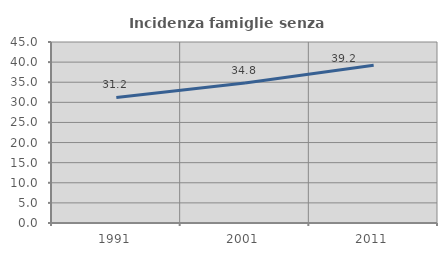
| Category | Incidenza famiglie senza nuclei |
|---|---|
| 1991.0 | 31.207 |
| 2001.0 | 34.795 |
| 2011.0 | 39.244 |